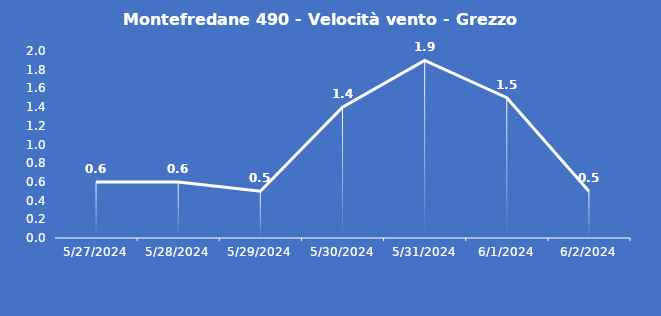
| Category | Montefredane 490 - Velocità vento - Grezzo (m/s) |
|---|---|
| 5/27/24 | 0.6 |
| 5/28/24 | 0.6 |
| 5/29/24 | 0.5 |
| 5/30/24 | 1.4 |
| 5/31/24 | 1.9 |
| 6/1/24 | 1.5 |
| 6/2/24 | 0.5 |